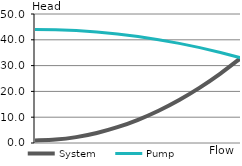
| Category | System | Pump |
|---|---|---|
| 0 | 1 | 44 |
| 1 | 1.32 | 43.89 |
| 2 | 2.28 | 43.56 |
| 3 | 3.88 | 43.01 |
| 4 | 6.12 | 42.24 |
| 5 | 9 | 41.25 |
| 6 | 12.52 | 40.04 |
| 7 | 16.68 | 38.61 |
| 8 | 21.48 | 36.96 |
| 9 | 26.92 | 35.09 |
| 10 | 33 | 33 |